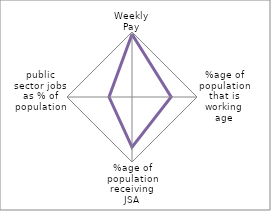
| Category | Series 3 |
|---|---|
| Weekly Pay | 194 |
| %age of population that is working age | 121 |
| %age of population receiving JSA | 155 |
| public sector jobs as % of population | 71 |